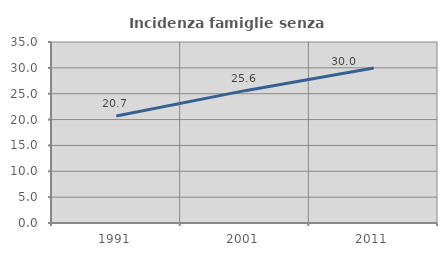
| Category | Incidenza famiglie senza nuclei |
|---|---|
| 1991.0 | 20.672 |
| 2001.0 | 25.593 |
| 2011.0 | 29.955 |